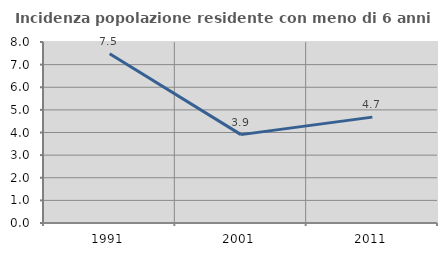
| Category | Incidenza popolazione residente con meno di 6 anni |
|---|---|
| 1991.0 | 7.479 |
| 2001.0 | 3.906 |
| 2011.0 | 4.68 |